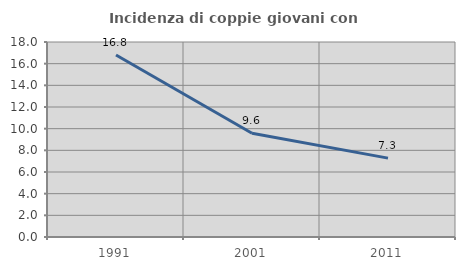
| Category | Incidenza di coppie giovani con figli |
|---|---|
| 1991.0 | 16.797 |
| 2001.0 | 9.571 |
| 2011.0 | 7.283 |